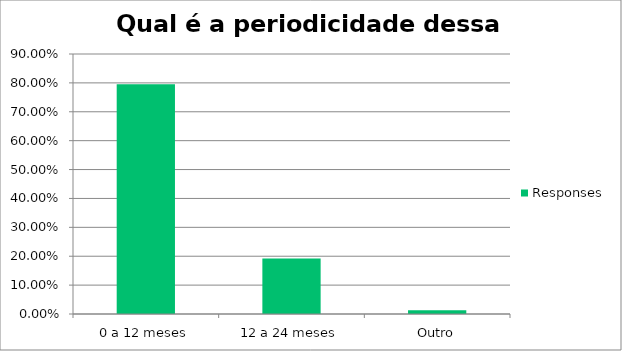
| Category | Responses |
|---|---|
| 0 a 12 meses | 0.795 |
| 12 a 24 meses | 0.192 |
| Outro | 0.013 |